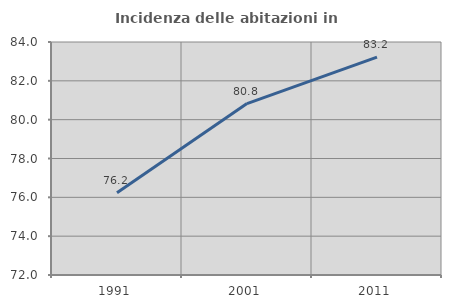
| Category | Incidenza delle abitazioni in proprietà  |
|---|---|
| 1991.0 | 76.231 |
| 2001.0 | 80.828 |
| 2011.0 | 83.222 |